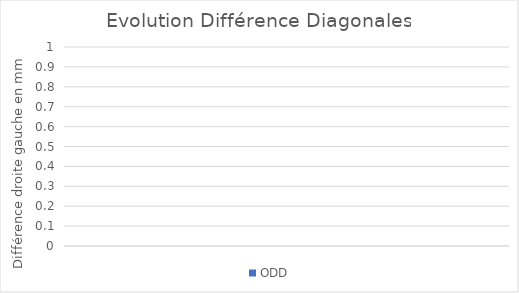
| Category | ODD |
|---|---|
|  | 0 |
|  | 0 |
|  | 0 |
|  | 0 |
|  | 0 |
|  | 0 |
|  | 0 |
|  | 0 |
|  | 0 |